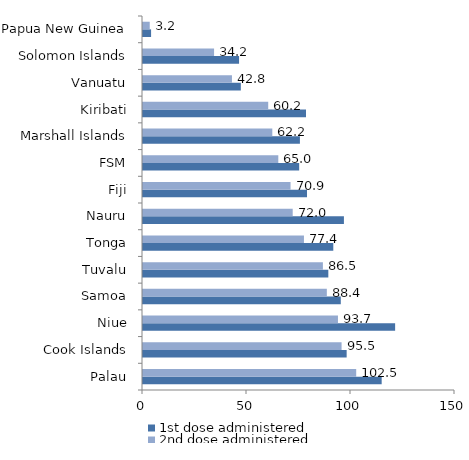
| Category | 1st dose administered | 2nd dose administered |
|---|---|---|
| Palau | 114.747 | 102.503 |
| Cook Islands | 97.91 | 95.469 |
| Niue | 121.214 | 93.734 |
| Samoa | 95.09 | 88.384 |
| Tuvalu | 89.098 | 86.491 |
| Tonga | 91.493 | 77.38 |
| Nauru | 96.596 | 71.974 |
| Fiji | 78.849 | 70.933 |
| FSM | 75.085 | 65.048 |
| Marshall Islands | 75.438 | 62.17 |
| Kiribati | 78.367 | 60.201 |
| Vanuatu | 47.03 | 42.767 |
| Solomon Islands | 46.187 | 34.168 |
| Papua New Guinea | 3.886 | 3.241 |